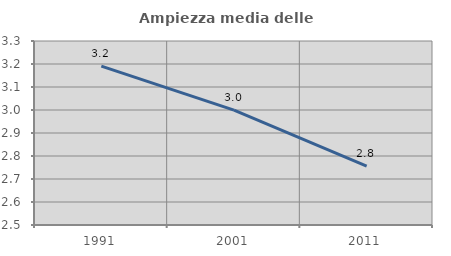
| Category | Ampiezza media delle famiglie |
|---|---|
| 1991.0 | 3.191 |
| 2001.0 | 3 |
| 2011.0 | 2.756 |